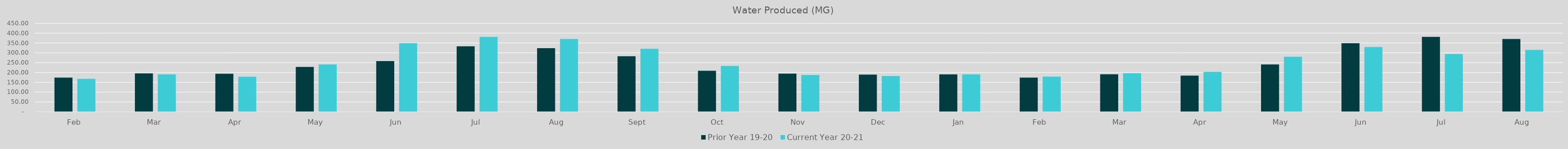
| Category | Prior Year 19-20  | Current Year 20-21 |
|---|---|---|
| Feb | 173.847 | 167.532 |
| Mar | 195.333 | 190.306 |
| Apr | 193.551 | 178.22 |
| May | 228.091 | 240.625 |
| Jun | 257.9 | 348.57 |
| Jul | 333.37 | 381.34 |
| Aug | 323.49 | 370.12 |
| Sep | 282.53 | 320.39 |
| Oct | 208.72 | 233.34 |
| Nov | 193.92 | 187.14 |
| Dec | 188.86 | 182.02 |
| Jan | 189.94 | 189.96 |
| Feb | 173.75 | 178.97 |
| Mar | 190.77 | 195.96 |
| Apr | 184.23 | 203.05 |
| May | 240.63 | 280.19 |
| Jun | 348.57 | 329.038 |
| Jul | 381.336 | 293.585 |
| Aug | 370.12 | 314.51 |